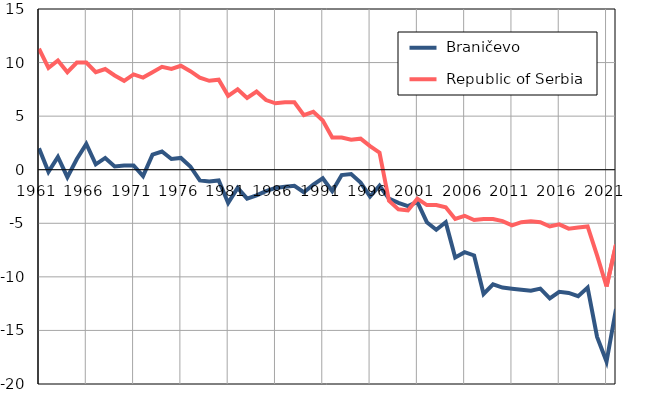
| Category |  Braničevo |  Republic of Serbia |
|---|---|---|
| 1961.0 | 2 | 11.3 |
| 1962.0 | -0.2 | 9.5 |
| 1963.0 | 1.2 | 10.2 |
| 1964.0 | -0.7 | 9.1 |
| 1965.0 | 1 | 10 |
| 1966.0 | 2.4 | 10 |
| 1967.0 | 0.5 | 9.1 |
| 1968.0 | 1.1 | 9.4 |
| 1969.0 | 0.3 | 8.8 |
| 1970.0 | 0.4 | 8.3 |
| 1971.0 | 0.4 | 8.9 |
| 1972.0 | -0.6 | 8.6 |
| 1973.0 | 1.4 | 9.1 |
| 1974.0 | 1.7 | 9.6 |
| 1975.0 | 1 | 9.4 |
| 1976.0 | 1.1 | 9.7 |
| 1977.0 | 0.3 | 9.2 |
| 1978.0 | -1 | 8.6 |
| 1979.0 | -1.1 | 8.3 |
| 1980.0 | -1 | 8.4 |
| 1981.0 | -3.1 | 6.9 |
| 1982.0 | -1.7 | 7.5 |
| 1983.0 | -2.7 | 6.7 |
| 1984.0 | -2.4 | 7.3 |
| 1985.0 | -2 | 6.5 |
| 1986.0 | -1.7 | 6.2 |
| 1987.0 | -1.6 | 6.3 |
| 1988.0 | -1.5 | 6.3 |
| 1989.0 | -2.1 | 5.1 |
| 1990.0 | -1.4 | 5.4 |
| 1991.0 | -0.8 | 4.6 |
| 1992.0 | -2 | 3 |
| 1993.0 | -0.5 | 3 |
| 1994.0 | -0.4 | 2.8 |
| 1995.0 | -1.2 | 2.9 |
| 1996.0 | -2.5 | 2.2 |
| 1997.0 | -1.5 | 1.6 |
| 1998.0 | -2.7 | -2.9 |
| 1999.0 | -3.1 | -3.7 |
| 2000.0 | -3.4 | -3.8 |
| 2001.0 | -3 | -2.7 |
| 2002.0 | -4.9 | -3.3 |
| 2003.0 | -5.6 | -3.3 |
| 2004.0 | -4.9 | -3.5 |
| 2005.0 | -8.2 | -4.6 |
| 2006.0 | -7.7 | -4.3 |
| 2007.0 | -8 | -4.7 |
| 2008.0 | -11.6 | -4.6 |
| 2009.0 | -10.7 | -4.6 |
| 2010.0 | -11 | -4.8 |
| 2011.0 | -11.1 | -5.2 |
| 2012.0 | -11.2 | -4.9 |
| 2013.0 | -11.3 | -4.8 |
| 2014.0 | -11.1 | -4.9 |
| 2015.0 | -12 | -5.3 |
| 2016.0 | -11.4 | -5.1 |
| 2017.0 | -11.5 | -5.5 |
| 2018.0 | -11.8 | -5.4 |
| 2019.0 | -11 | -5.3 |
| 2020.0 | -15.6 | -8 |
| 2021.0 | -17.9 | -10.9 |
| 2022.0 | -13 | -7 |